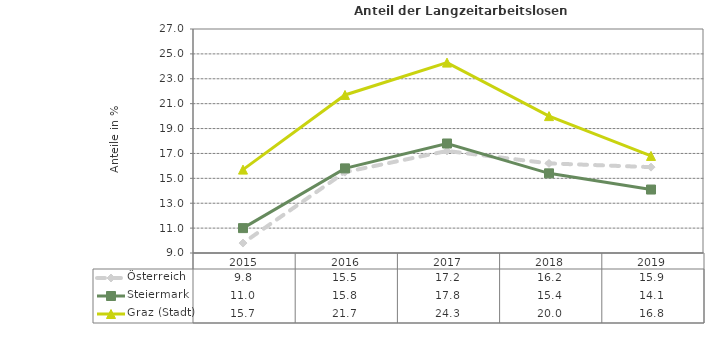
| Category | Österreich | Steiermark | Graz (Stadt) |
|---|---|---|---|
| 2019.0 | 15.9 | 14.1 | 16.8 |
| 2018.0 | 16.2 | 15.4 | 20 |
| 2017.0 | 17.2 | 17.8 | 24.3 |
| 2016.0 | 15.5 | 15.8 | 21.7 |
| 2015.0 | 9.8 | 11 | 15.7 |